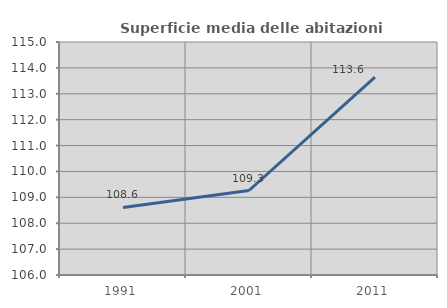
| Category | Superficie media delle abitazioni occupate |
|---|---|
| 1991.0 | 108.611 |
| 2001.0 | 109.264 |
| 2011.0 | 113.644 |